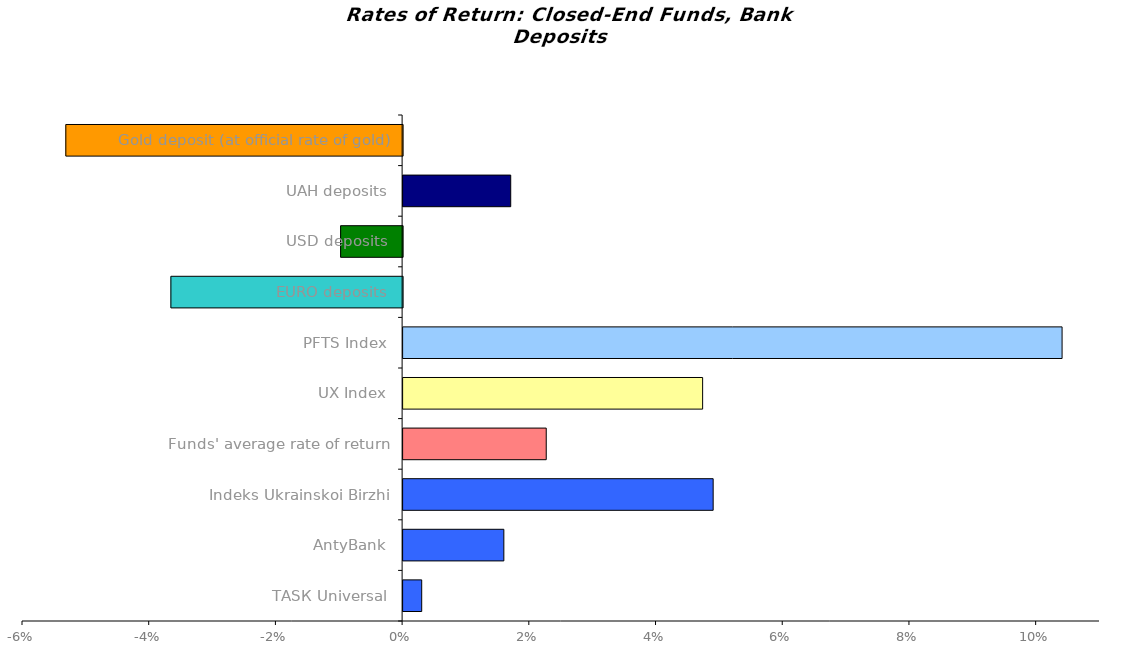
| Category | Series 0 |
|---|---|
| ТАSК Universal | 0.003 |
| AntyBank | 0.016 |
| Indeks Ukrainskoi Birzhi | 0.049 |
| Funds' average rate of return | 0.023 |
| UX Index | 0.047 |
| PFTS Index | 0.104 |
| EURO deposits | -0.037 |
| USD deposits | -0.01 |
| UAH deposits | 0.017 |
| Gold deposit (at official rate of gold) | -0.053 |